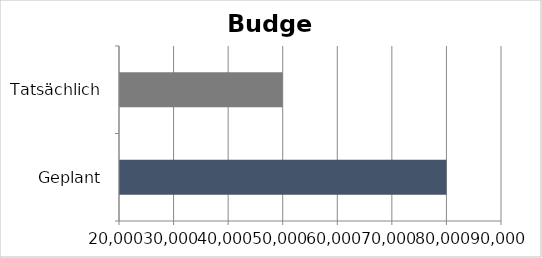
| Category | Series 0 |
|---|---|
| Geplant | 80000 |
| Tatsächlich | 50000 |